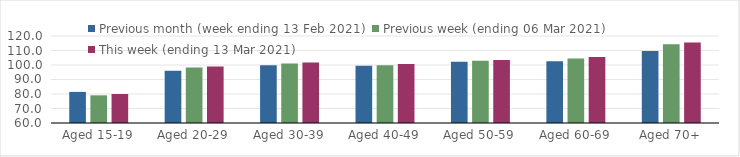
| Category | Previous month (week ending 13 Feb 2021) | Previous week (ending 06 Mar 2021) | This week (ending 13 Mar 2021) |
|---|---|---|---|
| Aged 15-19 | 81.44 | 79.08 | 80 |
| Aged 20-29 | 96.1 | 98.21 | 98.94 |
| Aged 30-39 | 99.86 | 101 | 101.69 |
| Aged 40-49 | 99.5 | 99.85 | 100.68 |
| Aged 50-59 | 102.2 | 102.9 | 103.48 |
| Aged 60-69 | 102.65 | 104.52 | 105.59 |
| Aged 70+ | 109.63 | 114.39 | 115.59 |